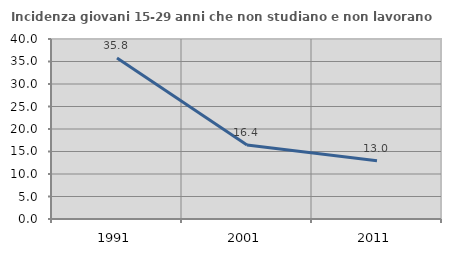
| Category | Incidenza giovani 15-29 anni che non studiano e non lavorano  |
|---|---|
| 1991.0 | 35.802 |
| 2001.0 | 16.443 |
| 2011.0 | 12.969 |